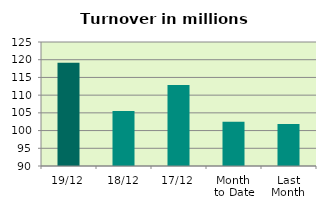
| Category | Series 0 |
|---|---|
| 19/12 | 119.117 |
| 18/12 | 105.511 |
| 17/12 | 112.829 |
| Month 
to Date | 102.488 |
| Last
Month | 101.866 |